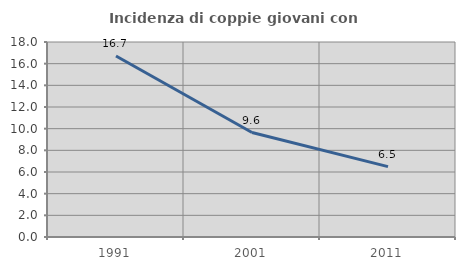
| Category | Incidenza di coppie giovani con figli |
|---|---|
| 1991.0 | 16.709 |
| 2001.0 | 9.646 |
| 2011.0 | 6.499 |